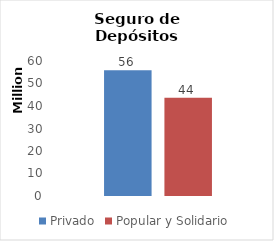
| Category | Privado | Popular y Solidario |
|---|---|---|
| 0 | 55909982.54 | 43667692.83 |